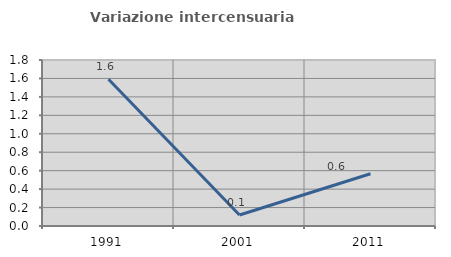
| Category | Variazione intercensuaria annua |
|---|---|
| 1991.0 | 1.591 |
| 2001.0 | 0.119 |
| 2011.0 | 0.566 |